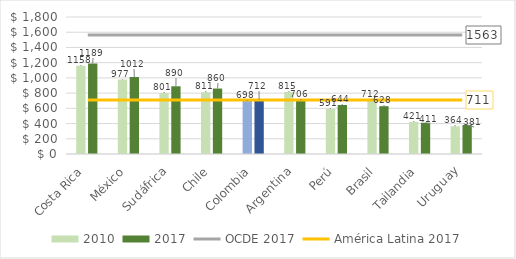
| Category | 2010 | 2017 |
|---|---|---|
| Costa Rica | 1158.485 | 1188.8 |
| México | 977.428 | 1011.921 |
| Sudáfrica | 801.025 | 889.803 |
| Chile | 810.755 | 860.017 |
| Colombia | 698.397 | 712.091 |
| Argentina | 814.983 | 705.752 |
| Perú | 591.458 | 643.907 |
| Brasil | 712.399 | 628.199 |
| Tailandia | 421.447 | 410.567 |
| Uruguay | 364.422 | 380.725 |